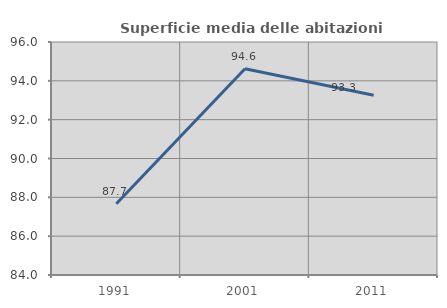
| Category | Superficie media delle abitazioni occupate |
|---|---|
| 1991.0 | 87.67 |
| 2001.0 | 94.62 |
| 2011.0 | 93.261 |